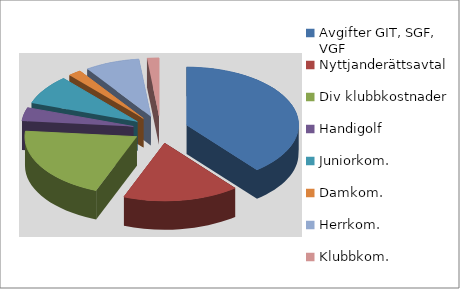
| Category | Series 0 |
|---|---|
| Avgifter GIT, SGF, VGF | 114224 |
| Nyttjanderättsavtal | 48875 |
| Div klubbkostnader | 60000 |
| Handigolf | 11000 |
| Juniorkom. | 24000 |
| Damkom. | 5500 |
| Herrkom. | 23000 |
| Klubbkom. | 5000 |